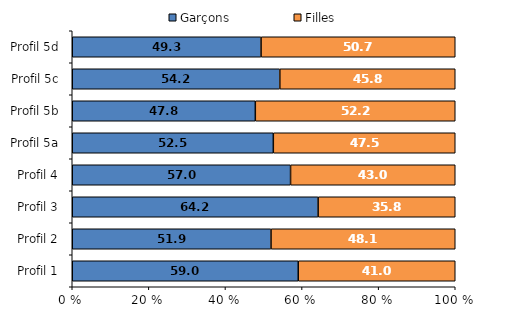
| Category | Garçons | Filles |
|---|---|---|
| Profil 1 | 59 | 41 |
| Profil 2 | 51.9 | 48.1 |
| Profil 3 | 64.2 | 35.8 |
| Profil 4 | 57 | 43 |
| Profil 5a | 52.5 | 47.5 |
| Profil 5b | 47.8 | 52.2 |
| Profil 5c | 54.2 | 45.8 |
| Profil 5d | 49.3 | 50.7 |